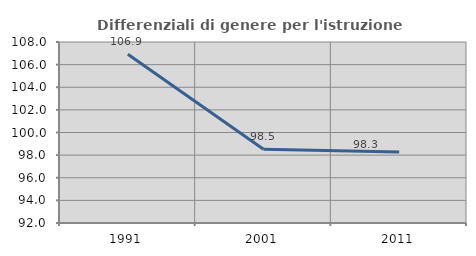
| Category | Differenziali di genere per l'istruzione superiore |
|---|---|
| 1991.0 | 106.918 |
| 2001.0 | 98.518 |
| 2011.0 | 98.287 |